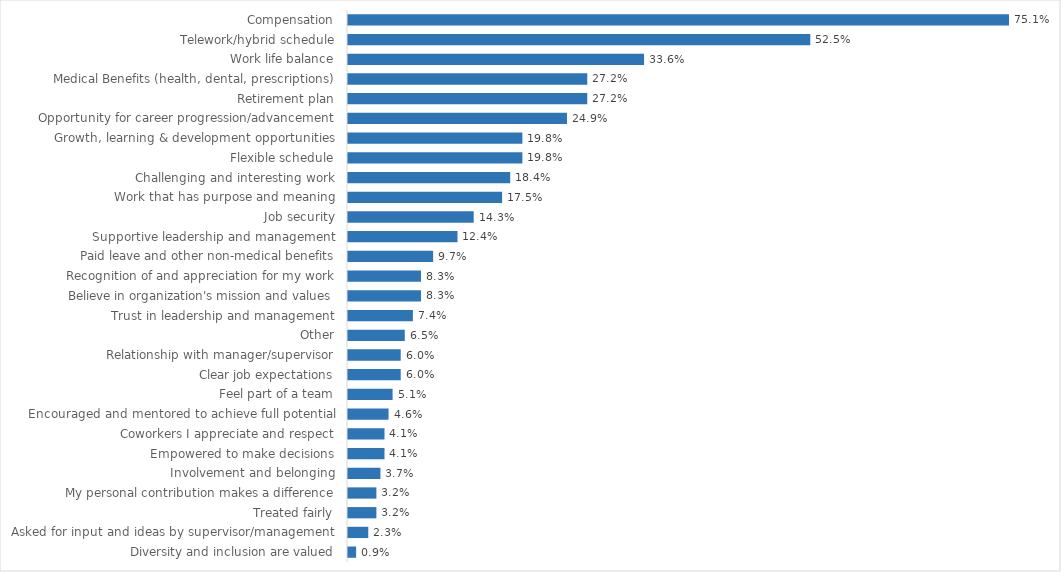
| Category | Digital Services |
|---|---|
| Compensation | 0.751 |
| Telework/hybrid schedule | 0.525 |
| Work life balance | 0.336 |
| Medical Benefits (health, dental, prescriptions) | 0.272 |
| Retirement plan | 0.272 |
| Opportunity for career progression/advancement | 0.249 |
| Growth, learning & development opportunities | 0.198 |
| Flexible schedule | 0.198 |
| Challenging and interesting work | 0.184 |
| Work that has purpose and meaning | 0.175 |
| Job security | 0.143 |
| Supportive leadership and management | 0.124 |
| Paid leave and other non-medical benefits | 0.097 |
| Recognition of and appreciation for my work | 0.083 |
| Believe in organization's mission and values | 0.083 |
| Trust in leadership and management | 0.074 |
| Other | 0.065 |
| Relationship with manager/supervisor | 0.06 |
| Clear job expectations | 0.06 |
| Feel part of a team | 0.051 |
| Encouraged and mentored to achieve full potential | 0.046 |
| Coworkers I appreciate and respect | 0.041 |
| Empowered to make decisions | 0.041 |
| Involvement and belonging | 0.037 |
| My personal contribution makes a difference | 0.032 |
| Treated fairly | 0.032 |
| Asked for input and ideas by supervisor/management | 0.023 |
| Diversity and inclusion are valued | 0.009 |